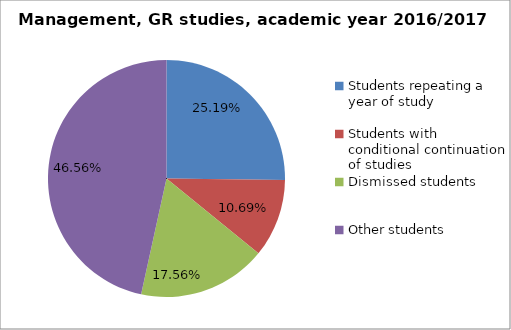
| Category | Series 0 |
|---|---|
| Students repeating a year of study | 33 |
| Students with conditional continuation of studies | 14 |
| Dismissed students | 23 |
| Other students | 61 |